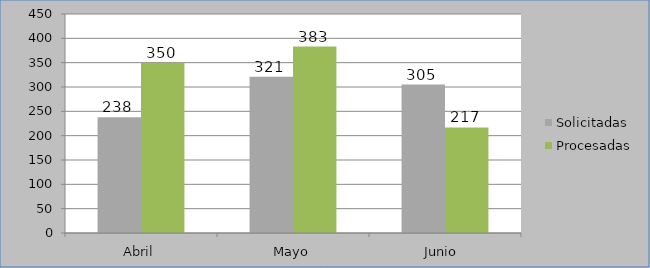
| Category | Solicitadas | Procesadas |
|---|---|---|
| Abril | 238 | 350 |
| Mayo | 321 | 383 |
| Junio  | 305 | 217 |